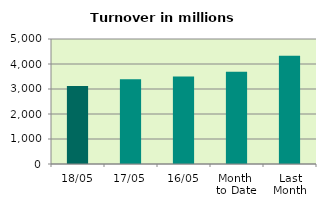
| Category | Series 0 |
|---|---|
| 18/05 | 3118.757 |
| 17/05 | 3386.956 |
| 16/05 | 3501.777 |
| Month 
to Date | 3691.636 |
| Last
Month | 4332.281 |